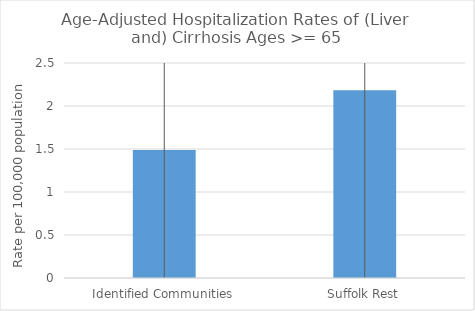
| Category | Age-Adjusted Hospitalization Rates of (Liver and) Cirrhosis Ages >= 65 |
|---|---|
| Identified Communities | 1.489 |
| Suffolk Rest | 2.184 |